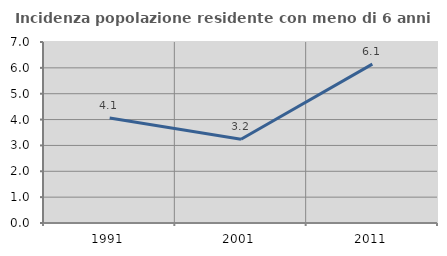
| Category | Incidenza popolazione residente con meno di 6 anni |
|---|---|
| 1991.0 | 4.06 |
| 2001.0 | 3.238 |
| 2011.0 | 6.146 |